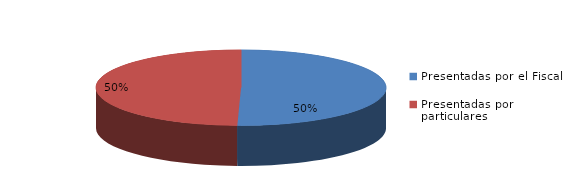
| Category | Series 0 |
|---|---|
| Presentadas por el Fiscal | 125 |
| Presentadas por particulares | 123 |